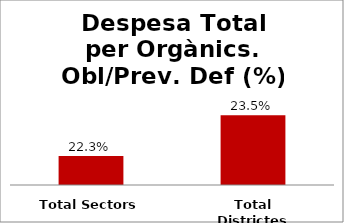
| Category | Series 0 |
|---|---|
| Total Sectors | 0.223 |
| Total Districtes | 0.235 |